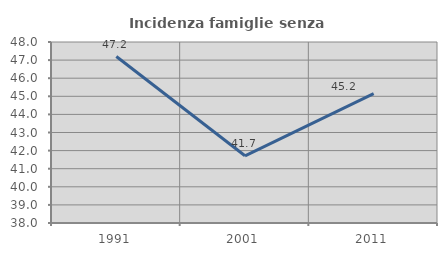
| Category | Incidenza famiglie senza nuclei |
|---|---|
| 1991.0 | 47.198 |
| 2001.0 | 41.713 |
| 2011.0 | 45.152 |